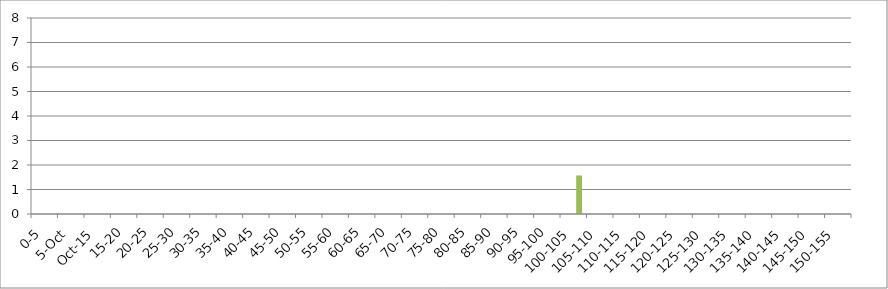
| Category | UNION_ALL | INTERSECTION_ALL | UNION(INTERSECTION_119875_146067,INTERSECTION_119875_241240,INTERSECTION_146067_241240) |
|---|---|---|---|
| 0-5 | 0 | 0 | 0 |
| 5-Oct | 0 | 0 | 0 |
| Oct-15 | 0 | 0 | 0 |
| 15-20 | 0 | 0 | 0 |
| 20-25 | 0 | 0 | 0 |
| 25-30 | 0 | 0 | 0 |
| 30-35 | 0 | 0 | 0 |
| 35-40 | 0 | 0 | 0 |
| 40-45 | 0 | 0 | 0 |
| 45-50 | 0 | 0 | 0 |
| 50-55 | 0 | 0 | 0 |
| 55-60 | 0 | 0 | 0 |
| 60-65 | 0 | 0 | 0 |
| 65-70 | 0 | 0 | 0 |
| 70-75 | 0 | 0 | 0 |
| 75-80 | 0 | 0 | 0 |
| 80-85 | 0 | 0 | 0 |
| 85-90 | 0 | 0 | 0 |
| 90-95 | 0 | 0 | 0 |
| 95-100 | 0 | 0 | 0 |
| 100-105 | 0 | 0 | 1.573 |
| 105-110 | 0 | 0 | 0 |
| 110-115 | 0 | 0 | 0 |
| 115-120 | 0 | 0 | 0 |
| 120-125 | 0 | 0 | 0 |
| 125-130 | 0 | 0 | 0 |
| 130-135 | 0 | 0 | 0 |
| 135-140 | 0 | 0 | 0 |
| 140-145 | 0 | 0 | 0 |
| 145-150 | 0 | 0 | 0 |
| 150-155 | 0 | 0 | 0 |